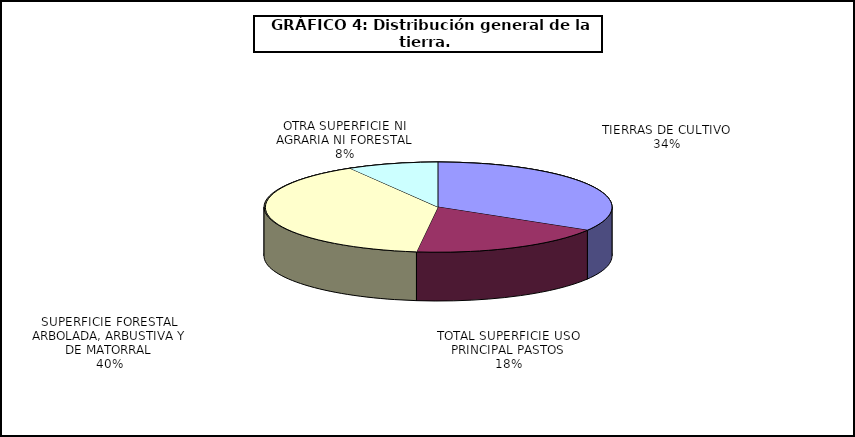
| Category | Series 0 |
|---|---|
| TIERRAS DE CULTIVO | 16985176 |
| TOTAL SUPERFICIE USO PRINCIPAL PASTOS | 9310363 |
| SUPERFICIE FORESTAL ARBOLADA, ARBUSTIVA Y DE MATORRAL | 20026970 |
| OTRA SUPERFICIE NI AGRARIA NI FORESTAL | 4271014 |